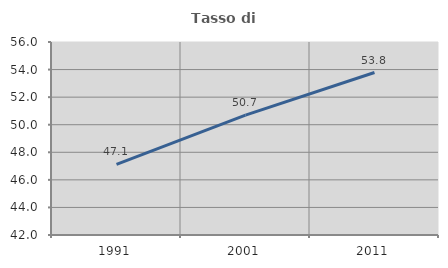
| Category | Tasso di occupazione   |
|---|---|
| 1991.0 | 47.125 |
| 2001.0 | 50.693 |
| 2011.0 | 53.785 |